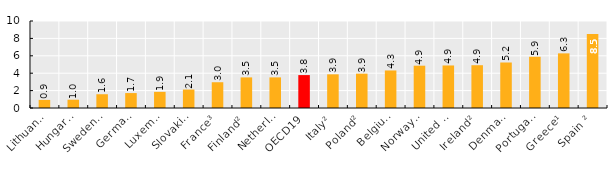
| Category | Observed |
|---|---|
| Lithuania¹  | 0.931 |
| Hungary¹  | 0.952 |
| Sweden¹  | 1.582 |
| Germany² | 1.715 |
| Luxembourg² | 1.856 |
| Slovakia¹  | 2.121 |
| France³ | 2.961 |
| Finland² | 3.517 |
| Netherlands² | 3.519 |
| OECD19 | 3.782 |
| Italy² | 3.871 |
| Poland² | 3.946 |
| Belgium¹  | 4.314 |
| Norway¹  | 4.863 |
| United Kingdom² | 4.889 |
| Ireland² | 4.917 |
| Denmark¹  | 5.23 |
| Portugal² | 5.89 |
| Greece¹  | 6.281 |
| Spain ² | 8.505 |